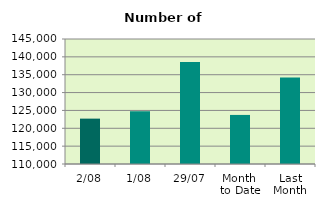
| Category | Series 0 |
|---|---|
| 2/08 | 122704 |
| 1/08 | 124776 |
| 29/07 | 138594 |
| Month 
to Date | 123740 |
| Last
Month | 134197.333 |